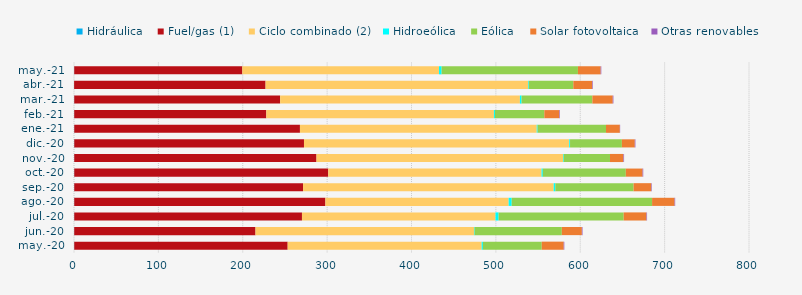
| Category | Hidráulica | Fuel/gas (1) | Ciclo combinado (2) | Hidroeólica | Eólica | Solar fotovoltaica | Otras renovables |
|---|---|---|---|---|---|---|---|
| may.-20 | 0.288 | 252.958 | 229.929 | 1.443 | 69.75 | 26.044 | 0.706 |
| jun.-20 | 0.272 | 214.832 | 258.953 | 0.743 | 103.362 | 23.75 | 0.785 |
| jul.-20 | 0.29 | 269.887 | 229.388 | 3.652 | 148.255 | 27.015 | 0.694 |
| ago.-20 | 0.294 | 297.661 | 217.205 | 3.576 | 166.404 | 26.667 | 0.691 |
| sep.-20 | 0.292 | 271.163 | 297.078 | 1.912 | 92.772 | 20.952 | 0.65 |
| oct.-20 | 0.299 | 301.034 | 252.831 | 1.457 | 98.401 | 19.852 | 0.783 |
| nov.-20 | 0.285 | 287.125 | 292.221 | 0.822 | 54.805 | 15.933 | 0.743 |
| dic.-20 | 0.3 | 272.275 | 314.373 | 0.959 | 61.442 | 15.285 | 0.753 |
| ene.-21 | 0.298 | 267.491 | 280.66 | 0.993 | 81.105 | 16.368 | 0.359 |
| feb.-21 | 0.259 | 227.675 | 269.761 | 1.226 | 58.505 | 17.767 | 0.7 |
| mar.-21 | 0.282 | 244.022 | 284.196 | 1.921 | 83.922 | 24.173 | 0.792 |
| abr.-21 | 0.138 | 226.895 | 311.21 | 0.836 | 52.701 | 22.41 | 0.722 |
| may.-21 | 0.268 | 199.21 | 233.09 | 3.085 | 161.613 | 26.955 | 0.723 |